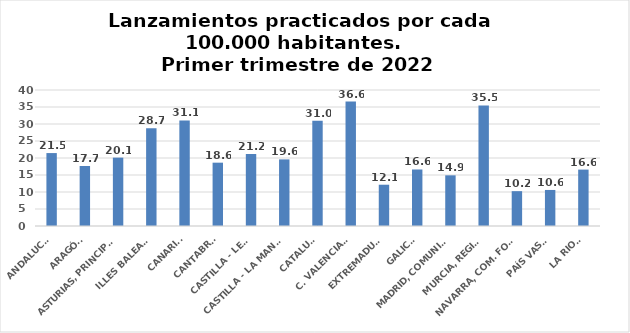
| Category | Series 0 |
|---|---|
| ANDALUCÍA | 21.45 |
| ARAGÓN | 17.656 |
| ASTURIAS, PRINCIPADO | 20.11 |
| ILLES BALEARS | 28.735 |
| CANARIAS | 31.06 |
| CANTABRIA | 18.625 |
| CASTILLA - LEÓN | 21.181 |
| CASTILLA - LA MANCHA | 19.589 |
| CATALUÑA | 30.964 |
| C. VALENCIANA | 36.595 |
| EXTREMADURA | 12.141 |
| GALICIA | 16.622 |
| MADRID, COMUNIDAD | 14.901 |
| MURCIA, REGIÓN | 35.457 |
| NAVARRA, COM. FORAL | 10.247 |
| PAÍS VASCO | 10.602 |
| LA RIOJA | 16.589 |